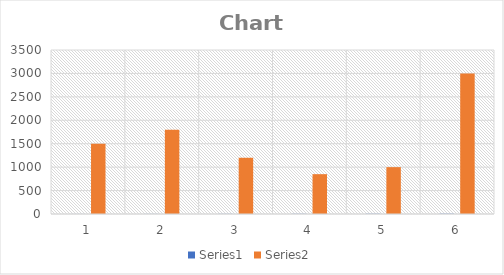
| Category | Series 0 | Series 1 |
|---|---|---|
| 0 | 1 | 1500 |
| 1 | 2 | 1800 |
| 2 | 3 | 1200 |
| 3 | 4 | 850 |
| 4 | 5 | 1000 |
| 5 | 6 | 3000 |